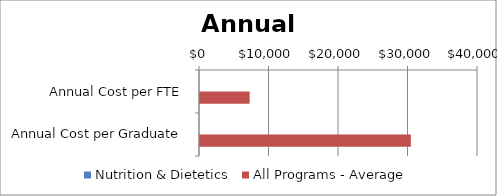
| Category | Nutrition & Dietetics | All Programs - Average |
|---|---|---|
| Annual Cost per FTE | 0 | 7144 |
| Annual Cost per Graduate | 0 | 30340 |